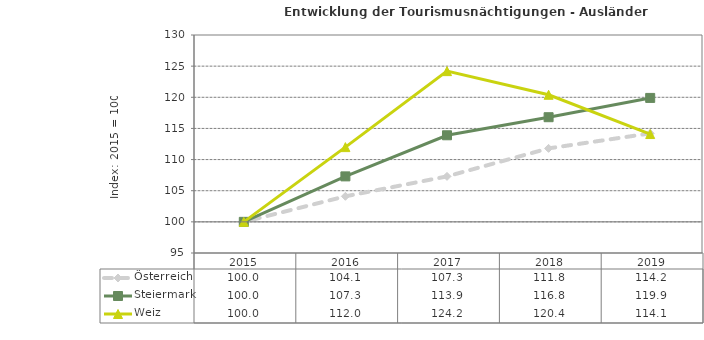
| Category | Österreich | Steiermark | Weiz |
|---|---|---|---|
| 2019.0 | 114.2 | 119.9 | 114.1 |
| 2018.0 | 111.8 | 116.8 | 120.4 |
| 2017.0 | 107.3 | 113.9 | 124.2 |
| 2016.0 | 104.1 | 107.3 | 112 |
| 2015.0 | 100 | 100 | 100 |